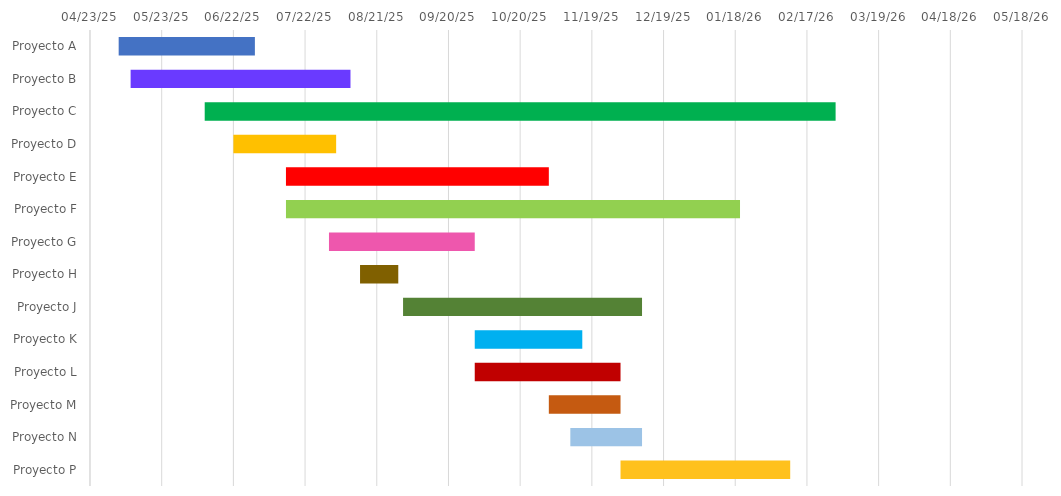
| Category | COMENZAR | Duración |
|---|---|---|
| Proyecto A | 2025-05-05 | 57 |
| Proyecto B | 2025-05-10 | 92 |
| Proyecto C | 2025-06-10 | 264 |
| Proyecto D | 2025-06-22 | 43 |
| Proyecto E | 2025-07-14 | 110 |
| Proyecto F | 2025-07-14 | 190 |
| Proyecto G | 2025-08-01 | 61 |
| Proyecto H | 2025-08-14 | 16 |
| Proyecto J | 2025-09-01 | 100 |
| Proyecto K | 2025-10-01 | 45 |
| Proyecto L | 2025-10-01 | 61 |
| Proyecto M | 2025-11-01 | 30 |
| Proyecto N | 2025-11-10 | 30 |
| Proyecto P | 2025-12-01 | 71 |